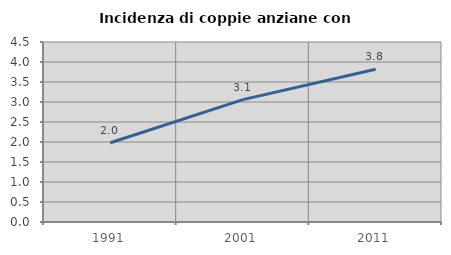
| Category | Incidenza di coppie anziane con figli |
|---|---|
| 1991.0 | 1.981 |
| 2001.0 | 3.059 |
| 2011.0 | 3.818 |